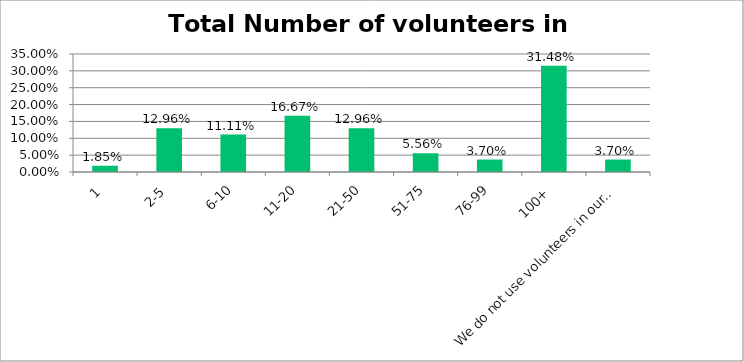
| Category | Responses |
|---|---|
| 1 | 0.018 |
| 2-5 | 0.13 |
| 6-10 | 0.111 |
| 11-20 | 0.167 |
| 21-50 | 0.13 |
| 51-75 | 0.056 |
| 76-99 | 0.037 |
| 100+ | 0.315 |
| We do not use volunteers in our organization | 0.037 |